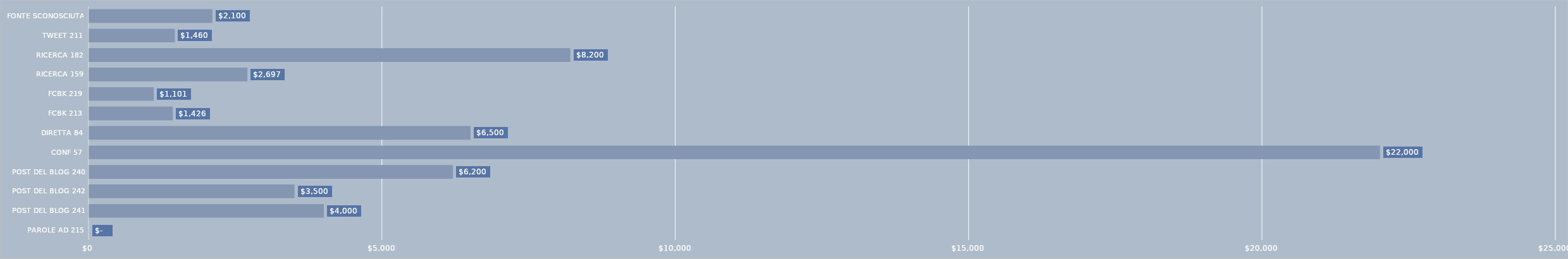
| Category | Series 0 |
|---|---|
| PAROLE AD 215 | 0 |
| POST DEL BLOG 241 | 4000 |
| POST DEL BLOG 242 | 3500 |
| POST DEL BLOG 240 | 6200 |
| CONF 57 | 22000 |
| DIRETTA 84 | 6500 |
| FCBK 213 | 1426 |
| FCBK 219 | 1101 |
| RICERCA 159 | 2697 |
| RICERCA 182 | 8200 |
| TWEET 211 | 1460 |
| FONTE SCONOSCIUTA | 2100 |